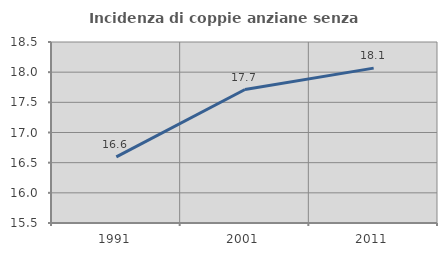
| Category | Incidenza di coppie anziane senza figli  |
|---|---|
| 1991.0 | 16.596 |
| 2001.0 | 17.713 |
| 2011.0 | 18.067 |